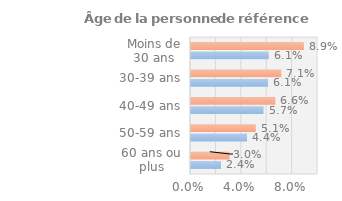
| Category | Series 0 | Series 1 |
|---|---|---|
| 60 ans ou plus | 0.024 | 0.03 |
| 50-59 ans | 0.044 | 0.051 |
| 40-49 ans | 0.057 | 0.066 |
| 30-39 ans | 0.061 | 0.071 |
| Moins de 30 ans | 0.061 | 0.089 |